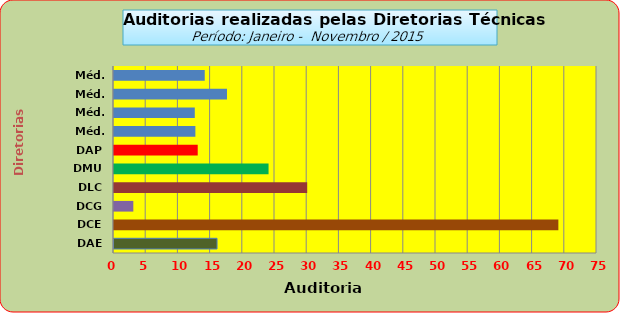
| Category | Series 0 |
|---|---|
| DAE | 16 |
| DCE | 69 |
| DCG | 3 |
| DLC | 30 |
| DMU | 24 |
| DAP | 13 |
| Méd. 2011 | 12.636 |
| Méd. 2012 | 12.545 |
| Méd. 2013 | 17.545 |
| Méd. 2014 | 14.091 |